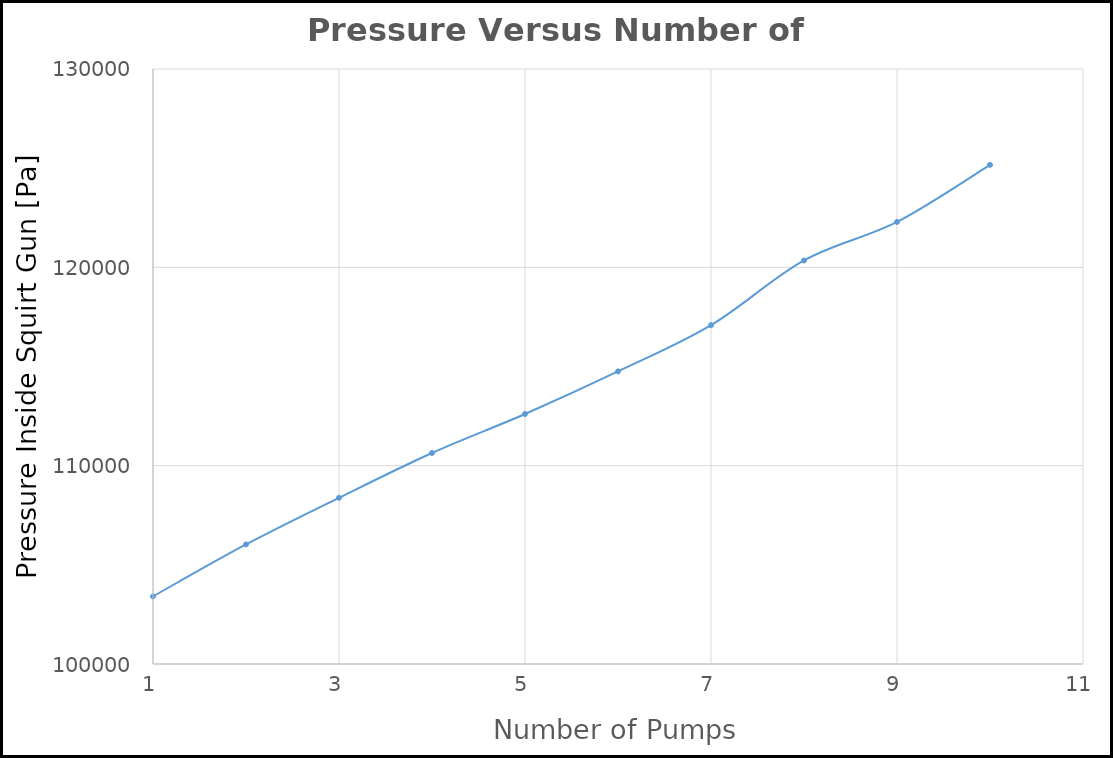
| Category | Series 0 |
|---|---|
| 1.0 | 103409.922 |
| 2.0 | 106028.108 |
| 3.0 | 108380.385 |
| 4.0 | 110639.687 |
| 5.0 | 112605.186 |
| 6.0 | 114752.917 |
| 7.0 | 117082.88 |
| 8.0 | 120346.316 |
| 9.0 | 122289.501 |
| 10.0 | 125166.159 |